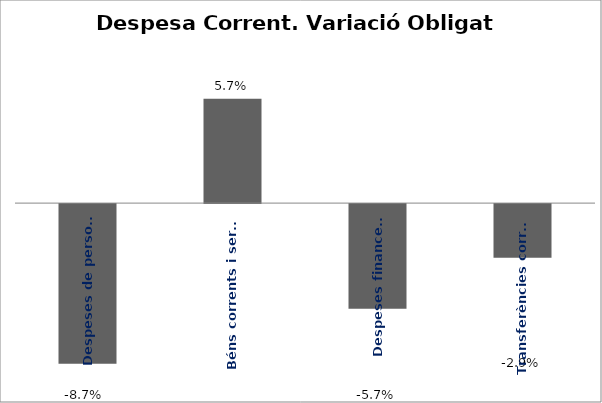
| Category | Series 0 |
|---|---|
| Despeses de personal | -0.087 |
| Béns corrents i serveis | 0.057 |
| Despeses financeres | -0.057 |
| Transferències corrents | -0.029 |